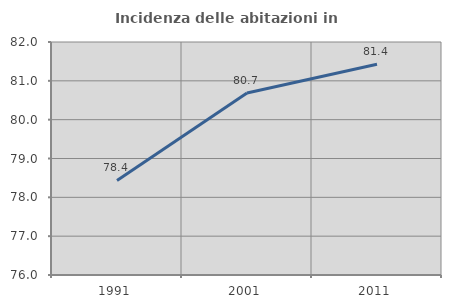
| Category | Incidenza delle abitazioni in proprietà  |
|---|---|
| 1991.0 | 78.436 |
| 2001.0 | 80.685 |
| 2011.0 | 81.428 |